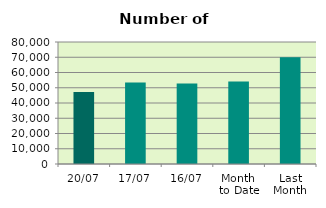
| Category | Series 0 |
|---|---|
| 20/07 | 47218 |
| 17/07 | 53402 |
| 16/07 | 52722 |
| Month 
to Date | 54030.857 |
| Last
Month | 70062.455 |